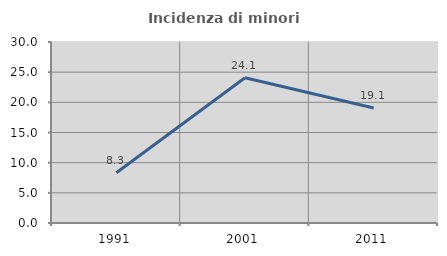
| Category | Incidenza di minori stranieri |
|---|---|
| 1991.0 | 8.333 |
| 2001.0 | 24.082 |
| 2011.0 | 19.06 |